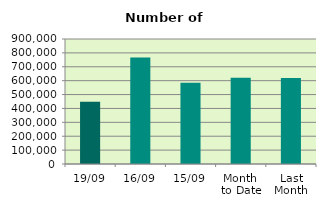
| Category | Series 0 |
|---|---|
| 19/09 | 449036 |
| 16/09 | 767054 |
| 15/09 | 585030 |
| Month 
to Date | 620310.615 |
| Last
Month | 618945.565 |